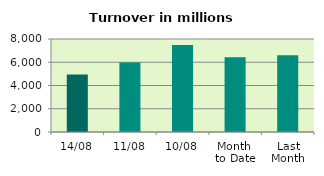
| Category | Series 0 |
|---|---|
| 14/08 | 4951.907 |
| 11/08 | 5976.233 |
| 10/08 | 7491.516 |
| Month 
to Date | 6419.464 |
| Last
Month | 6596.254 |